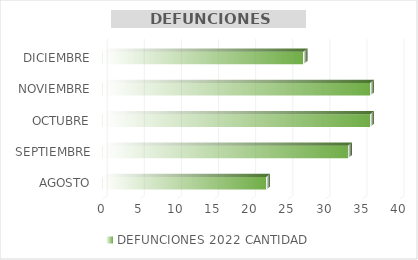
| Category | DEFUNCIONES 2022 |
|---|---|
| AGOSTO | 22 |
| SEPTIEMBRE | 33 |
| OCTUBRE | 36 |
| NOVIEMBRE | 36 |
| DICIEMBRE | 27 |